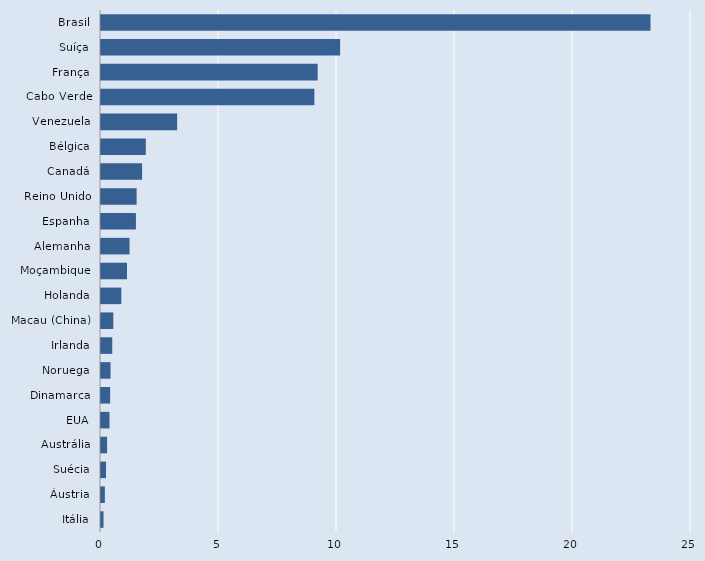
| Category | Series 0 |
|---|---|
| Itália | 0.107 |
| Áustria | 0.164 |
| Suécia | 0.212 |
| Austrália | 0.258 |
| EUA | 0.359 |
| Dinamarca | 0.388 |
| Noruega | 0.405 |
| Irlanda | 0.477 |
| Macau (China) | 0.521 |
| Holanda | 0.861 |
| Moçambique | 1.101 |
| Alemanha | 1.209 |
| Espanha | 1.48 |
| Reino Unido | 1.509 |
| Canadá | 1.742 |
| Bélgica | 1.898 |
| Venezuela | 3.227 |
| Cabo Verde | 9.041 |
| França | 9.181 |
| Suíça | 10.132 |
| Brasil | 23.284 |